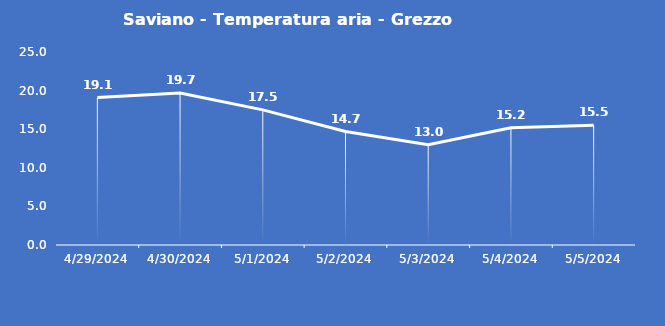
| Category | Saviano - Temperatura aria - Grezzo (°C) |
|---|---|
| 4/29/24 | 19.1 |
| 4/30/24 | 19.7 |
| 5/1/24 | 17.5 |
| 5/2/24 | 14.7 |
| 5/3/24 | 13 |
| 5/4/24 | 15.2 |
| 5/5/24 | 15.5 |